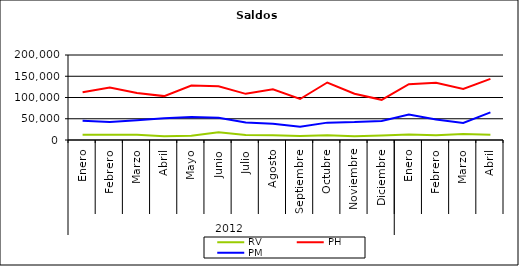
| Category | RV | PH | PM |
|---|---|---|---|
| 0 | 12341.813 | 112514.179 | 45537.16 |
| 1 | 12237.077 | 123774.486 | 42503.398 |
| 2 | 12097.047 | 110658.975 | 46279.761 |
| 3 | 8763.382 | 103284.021 | 51222.341 |
| 4 | 10161.6 | 128235.54 | 54214.606 |
| 5 | 18154.077 | 126306.439 | 52582.755 |
| 6 | 11880.973 | 108609.112 | 41317.962 |
| 7 | 11144.929 | 119136.85 | 38018.164 |
| 8 | 9436.917 | 96445.035 | 31265.858 |
| 9 | 11442.361 | 135264.99 | 40874.284 |
| 10 | 8920.043 | 108829.848 | 42115.15 |
| 11 | 10846.696 | 94519.382 | 44969.431 |
| 12 | 12966.437 | 131380.856 | 59975.653 |
| 13 | 11432.271 | 134655.891 | 48046.612 |
| 14 | 14149.543 | 120343.782 | 40297.909 |
| 15 | 12403.249 | 143830.507 | 64946.114 |